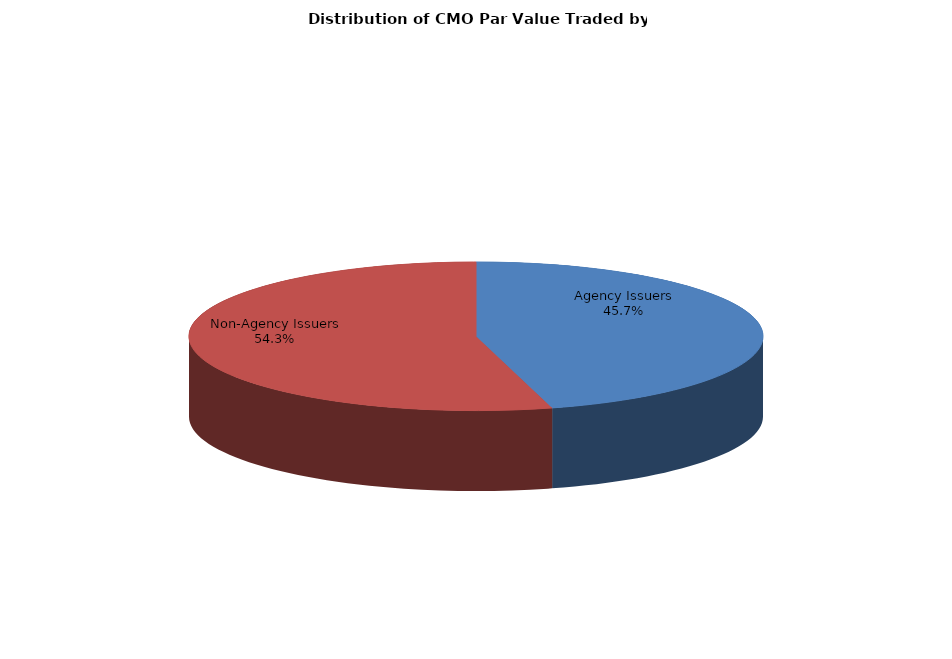
| Category | Series 0 |
|---|---|
| Agency Issuers | 5981315312.348 |
| Non-Agency Issuers | 7098852442.961 |